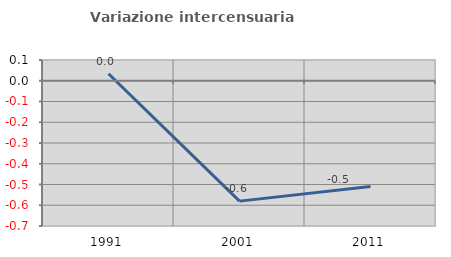
| Category | Variazione intercensuaria annua |
|---|---|
| 1991.0 | 0.034 |
| 2001.0 | -0.58 |
| 2011.0 | -0.51 |